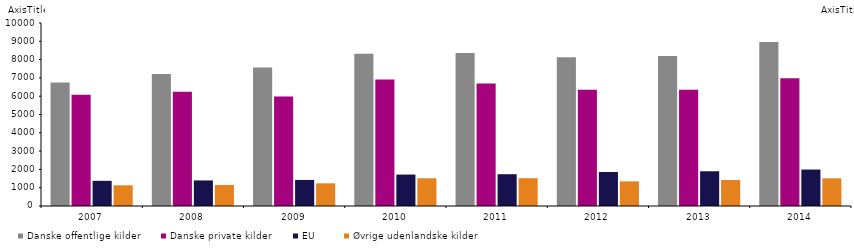
| Category | Danske offentlige kilder | Danske private kilder | EU | Øvrige udenlandske kilder |
|---|---|---|---|---|
| 2007.0 | 6755 | 6078 | 1376 | 1131 |
| 2008.0 | 7219.32 | 6247.945 | 1397.14 | 1149.01 |
| 2009.0 | 7571 | 5978 | 1424 | 1240 |
| 2010.0 | 8326 | 6909 | 1718 | 1515 |
| 2011.0 | 8367.411 | 6689 | 1738 | 1520 |
| 2012.0 | 8131 | 6356 | 1859 | 1346 |
| 2013.0 | 8194 | 6346 | 1898 | 1420 |
| 2014.0 | 8959 | 6980.351 | 1993 | 1512 |